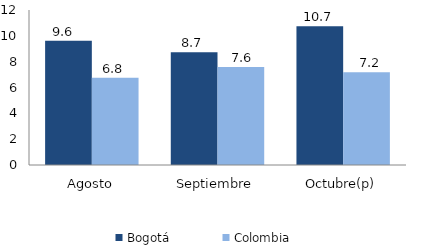
| Category | Bogotá | Colombia |
|---|---|---|
| Agosto | 9.621 | 6.762 |
| Septiembre | 8.732 | 7.596 |
| Octubre(p) | 10.748 | 7.173 |